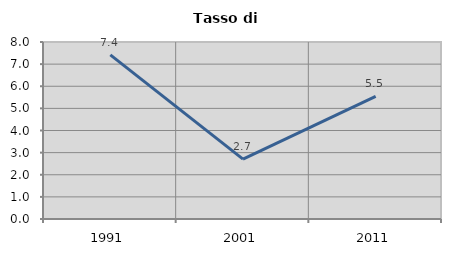
| Category | Tasso di disoccupazione   |
|---|---|
| 1991.0 | 7.417 |
| 2001.0 | 2.708 |
| 2011.0 | 5.546 |